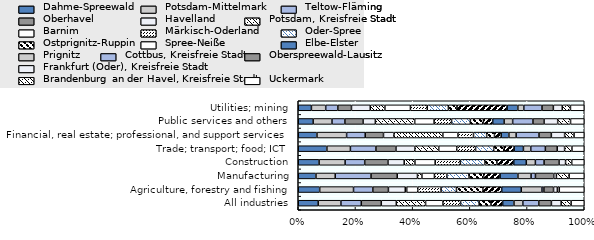
| Category | Dahme-Spreewald | Potsdam-Mittelmark | Teltow-Fläming | Oberhavel | Havelland | Potsdam, Kreisfreie Stadt | Barnim | Märkisch-Oderland | Oder-Spree | Ostprignitz-Ruppin | Spree-Neiße | Elbe-Elster | Prignitz | Cottbus, Kreisfreie Stadt | Oberspreewald-Lausitz | Frankfurt (Oder), Kreisfreie Stadt | Brandenburg an der Havel, Kreisfreie Stadt | Uckermark |
|---|---|---|---|---|---|---|---|---|---|---|---|---|---|---|---|---|---|---|
| All industries | 0.07 | 0.079 | 0.071 | 0.07 | 0.053 | 0.102 | 0.06 | 0.062 | 0.065 | 0.042 | 0.04 | 0.04 | 0.031 | 0.056 | 0.044 | 0.034 | 0.035 | 0.046 |
| Agriculture, forestry and fishing | 0.075 | 0.118 | 0.068 | 0.055 | 0.059 | 0.005 | 0.039 | 0.082 | 0.054 | 0.092 | 0.066 | 0.069 | 0.072 | 0.007 | 0.034 | 0.013 | 0.007 | 0.087 |
| Manufacturing | 0.062 | 0.067 | 0.125 | 0.092 | 0.071 | 0.016 | 0.044 | 0.043 | 0.077 | 0.051 | 0.057 | 0.062 | 0.046 | 0.015 | 0.064 | 0.009 | 0.045 | 0.053 |
| Construction | 0.073 | 0.091 | 0.068 | 0.081 | 0.057 | 0.037 | 0.071 | 0.088 | 0.085 | 0.042 | 0.059 | 0.044 | 0.032 | 0.03 | 0.052 | 0.023 | 0.022 | 0.044 |
| Trade; transport; food; ICT | 0.1 | 0.082 | 0.089 | 0.07 | 0.066 | 0.084 | 0.063 | 0.066 | 0.063 | 0.037 | 0.035 | 0.032 | 0.026 | 0.051 | 0.041 | 0.026 | 0.026 | 0.043 |
| Financial, real estate; professional, and support services | 0.065 | 0.104 | 0.065 | 0.064 | 0.037 | 0.171 | 0.053 | 0.055 | 0.046 | 0.027 | 0.023 | 0.027 | 0.025 | 0.08 | 0.043 | 0.046 | 0.033 | 0.036 |
| Public services and others | 0.052 | 0.066 | 0.045 | 0.064 | 0.043 | 0.138 | 0.068 | 0.061 | 0.066 | 0.046 | 0.032 | 0.04 | 0.03 | 0.071 | 0.039 | 0.048 | 0.045 | 0.048 |
| Utilities; mining | 0.046 | 0.05 | 0.042 | 0.048 | 0.066 | 0.051 | 0.089 | 0.059 | 0.074 | 0.03 | 0.175 | 0.038 | 0.021 | 0.064 | 0.04 | 0.031 | 0.029 | 0.048 |